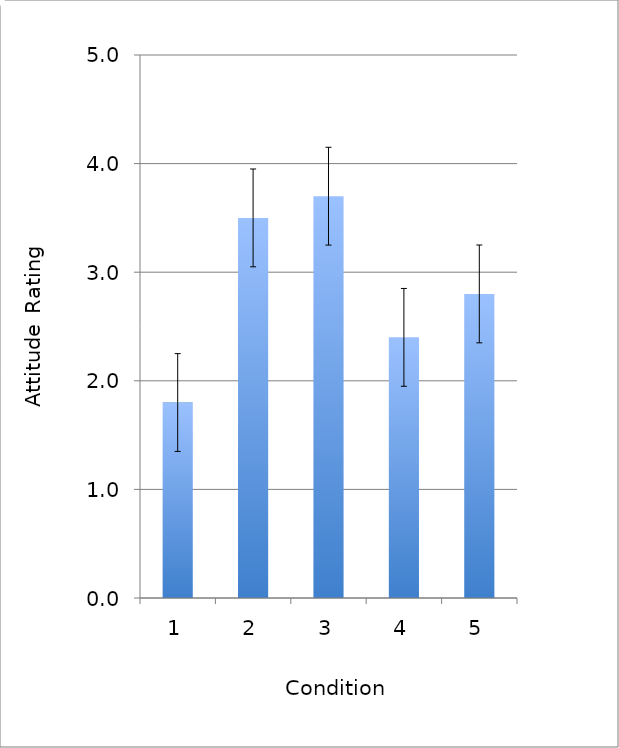
| Category | Series 0 |
|---|---|
| 0 | 1.8 |
| 1 | 3.5 |
| 2 | 3.7 |
| 3 | 2.4 |
| 4 | 2.8 |